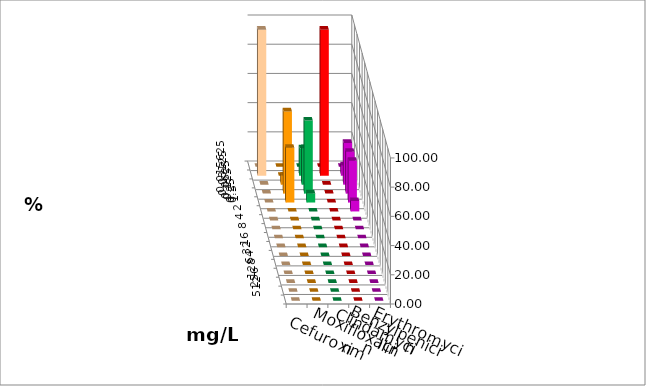
| Category | Cefuroxim | Moxifloxacin | Clindamycin | Benzylpenicillin | Erythromycin |
|---|---|---|---|---|---|
| 0.015625 | 0 | 0 | 0 | 0 | 0 |
| 0.03125 | 100 | 0 | 18.75 | 100 | 7.143 |
| 0.0625 | 0 | 6.25 | 25 | 0 | 28.571 |
| 0.125 | 0 | 56.25 | 50 | 0 | 28.571 |
| 0.25 | 0 | 37.5 | 6.25 | 0 | 28.571 |
| 0.5 | 0 | 0 | 0 | 0 | 7.143 |
| 1.0 | 0 | 0 | 0 | 0 | 0 |
| 2.0 | 0 | 0 | 0 | 0 | 0 |
| 4.0 | 0 | 0 | 0 | 0 | 0 |
| 8.0 | 0 | 0 | 0 | 0 | 0 |
| 16.0 | 0 | 0 | 0 | 0 | 0 |
| 32.0 | 0 | 0 | 0 | 0 | 0 |
| 64.0 | 0 | 0 | 0 | 0 | 0 |
| 128.0 | 0 | 0 | 0 | 0 | 0 |
| 256.0 | 0 | 0 | 0 | 0 | 0 |
| 512.0 | 0 | 0 | 0 | 0 | 0 |